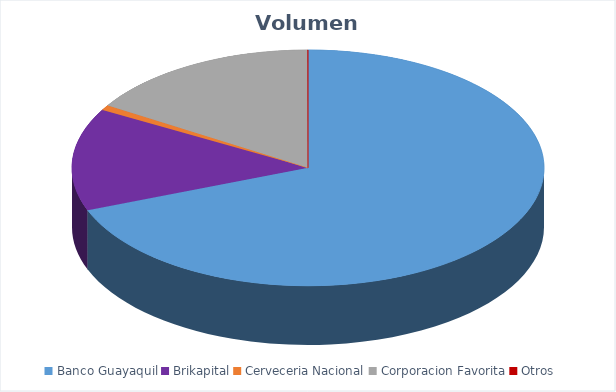
| Category | VOLUMEN ($USD) |
|---|---|
| Banco Guayaquil | 177558.8 |
| Brikapital | 36000 |
| Cerveceria Nacional | 1799.8 |
| Corporacion Favorita | 41315 |
| Otros | 66 |